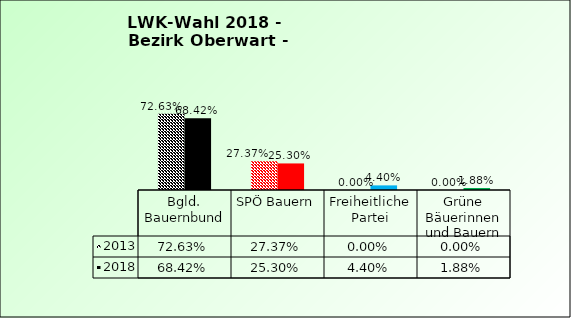
| Category | 2013 | 2018 |
|---|---|---|
| Bgld. Bauernbund | 0.726 | 0.684 |
| SPÖ Bauern | 0.274 | 0.253 |
| Freiheitliche Partei | 0 | 0.044 |
| Grüne Bäuerinnen und Bauern | 0 | 0.019 |